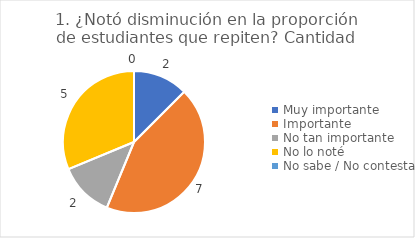
| Category | 1. ¿Notó disminución en la proporción de estudiantes que repiten? |
|---|---|
| Muy importante  | 0.125 |
| Importante  | 0.438 |
| No tan importante  | 0.125 |
| No lo noté  | 0.312 |
| No sabe / No contesta | 0 |